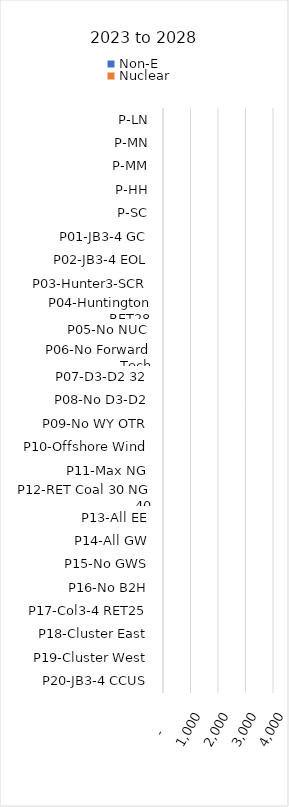
| Category | Non-E | Nuclear |
|---|---|---|
| P-LN | 0 | 0 |
| P-MN | 0 | 0 |
| P-MM | 0 | 0 |
| P-HH | 0 | 0 |
| P-SC | 0 | 0 |
| P01-JB3-4 GC | 0 | 0 |
| P02-JB3-4 EOL | 0 | 0 |
| P03-Hunter3-SCR | 0 | 0 |
| P04-Huntington RET28 | 0 | 0 |
| P05-No NUC | 0 | 0 |
| P06-No Forward Tech | 0 | 0 |
| P07-D3-D2 32 | 0 | 0 |
| P08-No D3-D2 | 0 | 0 |
| P09-No WY OTR | 0 | 0 |
| P10-Offshore Wind | 0 | 0 |
| P11-Max NG | 0 | 0 |
| P12-RET Coal 30 NG 40 | 0 | 0 |
| P13-All EE | 0 | 0 |
| P14-All GW | 0 | 0 |
| P15-No GWS | 0 | 0 |
| P16-No B2H | 0 | 0 |
| P17-Col3-4 RET25 | 0 | 0 |
| P18-Cluster East | 0 | 0 |
| P19-Cluster West | 0 | 0 |
| P20-JB3-4 CCUS | 0 | 0 |